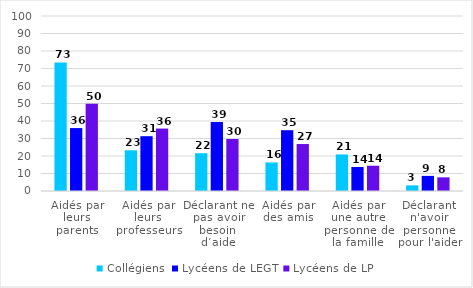
| Category | Collégiens | Lycéens de LEGT | Lycéens de LP |
|---|---|---|---|
| Aidés par leurs parents | 73.49 | 35.96 | 49.86 |
| Aidés par leurs professeurs | 23.27 | 31.32 | 35.68 |
| Déclarant ne pas avoir besoin d’aide | 21.59 | 39.38 | 29.7 |
| Aidés par des amis | 16.33 | 34.75 | 26.84 |
| Aidés par une autre personne de la famille | 20.89 | 13.72 | 14.43 |
| Déclarant n'avoir personne pour l'aider | 3.23 | 8.63 | 7.8 |